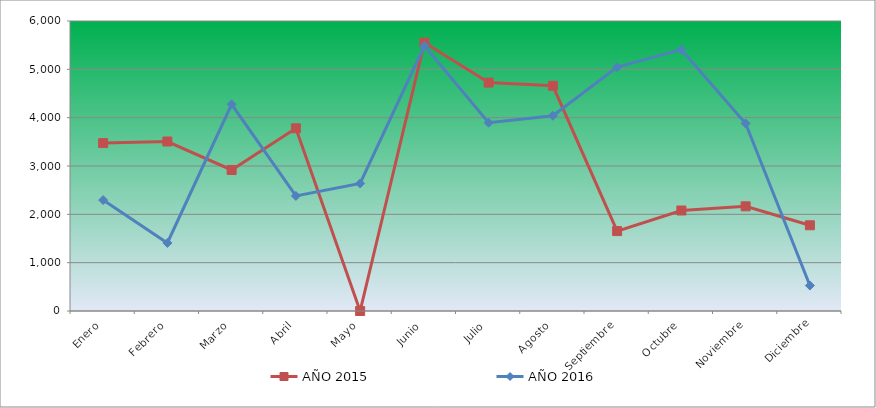
| Category | AÑO 2015 | AÑO 2016 |
|---|---|---|
| Enero | 3474.171 | 2294.523 |
| Febrero | 3506.65 | 1407.956 |
| Marzo | 2918.196 | 4275.903 |
| Abril | 3780.501 | 2380.927 |
| Mayo | 0 | 2638.986 |
| Junio | 5553.812 | 5485.36 |
| Julio | 4725.72 | 3896.279 |
| Agosto | 4658.809 | 4039.586 |
| Septiembre | 1653.395 | 5045.025 |
| Octubre | 2079.476 | 5408.43 |
| Noviembre | 2165.909 | 3880.728 |
| Diciembre | 1773.715 | 526.827 |